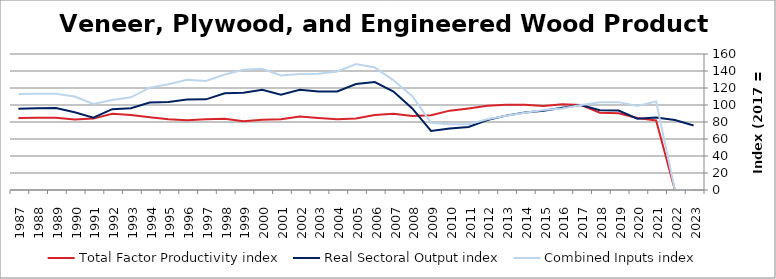
| Category | Total Factor Productivity index | Real Sectoral Output index | Combined Inputs index |
|---|---|---|---|
| 2023.0 | 0 | 75.857 | 0 |
| 2022.0 | 0 | 82.405 | 0 |
| 2021.0 | 81.831 | 85.151 | 104.057 |
| 2020.0 | 84.811 | 83.928 | 98.958 |
| 2019.0 | 90.403 | 93.443 | 103.362 |
| 2018.0 | 90.982 | 93.957 | 103.27 |
| 2017.0 | 100 | 100 | 100 |
| 2016.0 | 100.992 | 96.88 | 95.928 |
| 2015.0 | 98.948 | 93.126 | 94.116 |
| 2014.0 | 100.25 | 91.217 | 90.99 |
| 2013.0 | 100.233 | 87.518 | 87.314 |
| 2012.0 | 99.121 | 82.389 | 83.12 |
| 2011.0 | 96.017 | 74.228 | 77.308 |
| 2010.0 | 93.37 | 72.228 | 77.356 |
| 2009.0 | 87.879 | 69.449 | 79.028 |
| 2008.0 | 86.986 | 95.953 | 110.309 |
| 2007.0 | 89.746 | 115.839 | 129.073 |
| 2006.0 | 88.167 | 127.012 | 144.059 |
| 2005.0 | 84.062 | 124.59 | 148.213 |
| 2004.0 | 83.153 | 115.948 | 139.439 |
| 2003.0 | 84.787 | 115.952 | 136.757 |
| 2002.0 | 86.337 | 117.843 | 136.492 |
| 2001.0 | 83.194 | 112.175 | 134.835 |
| 2000.0 | 82.673 | 117.956 | 142.678 |
| 1999.0 | 80.905 | 114.522 | 141.552 |
| 1998.0 | 83.867 | 113.887 | 135.796 |
| 1997.0 | 83.202 | 106.669 | 128.206 |
| 1996.0 | 82.17 | 106.464 | 129.567 |
| 1995.0 | 83.157 | 103.517 | 124.485 |
| 1994.0 | 85.509 | 103 | 120.455 |
| 1993.0 | 88.18 | 96.123 | 109.007 |
| 1992.0 | 89.808 | 95.08 | 105.871 |
| 1991.0 | 84.007 | 85.026 | 101.213 |
| 1990.0 | 83.048 | 91.384 | 110.037 |
| 1989.0 | 85.069 | 96.376 | 113.291 |
| 1988.0 | 84.943 | 96.104 | 113.14 |
| 1987.0 | 84.753 | 95.654 | 112.862 |